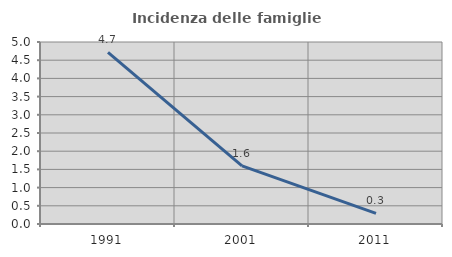
| Category | Incidenza delle famiglie numerose |
|---|---|
| 1991.0 | 4.715 |
| 2001.0 | 1.598 |
| 2011.0 | 0.294 |